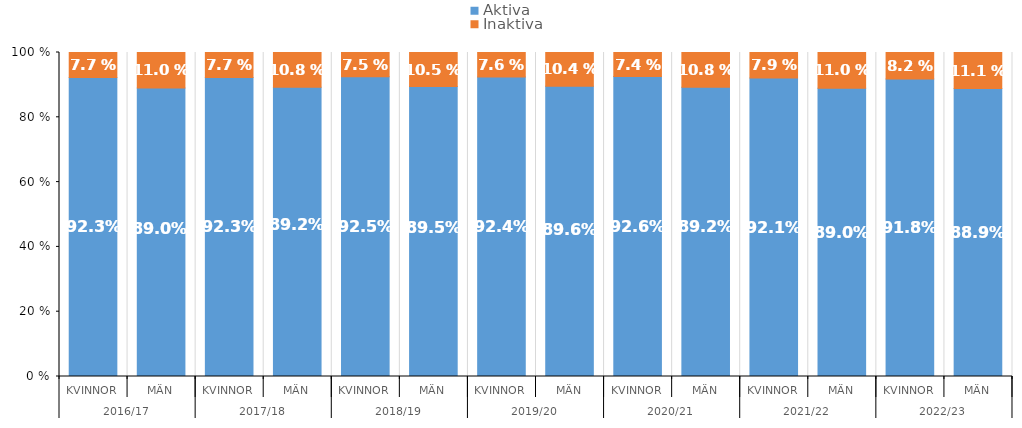
| Category | Aktiva | Inaktiva |
|---|---|---|
| 0 | 0.923 | 0.077 |
| 1 | 0.89 | 0.11 |
| 2 | 0.923 | 0.077 |
| 3 | 0.892 | 0.108 |
| 4 | 0.925 | 0.075 |
| 5 | 0.895 | 0.105 |
| 6 | 0.924 | 0.076 |
| 7 | 0.896 | 0.104 |
| 8 | 0.926 | 0.074 |
| 9 | 0.892 | 0.108 |
| 10 | 0.921 | 0.079 |
| 11 | 0.89 | 0.11 |
| 12 | 0.918 | 0.082 |
| 13 | 0.889 | 0.111 |